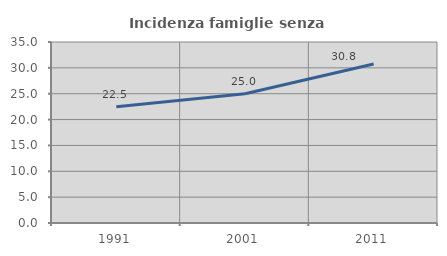
| Category | Incidenza famiglie senza nuclei |
|---|---|
| 1991.0 | 22.493 |
| 2001.0 | 24.984 |
| 2011.0 | 30.752 |